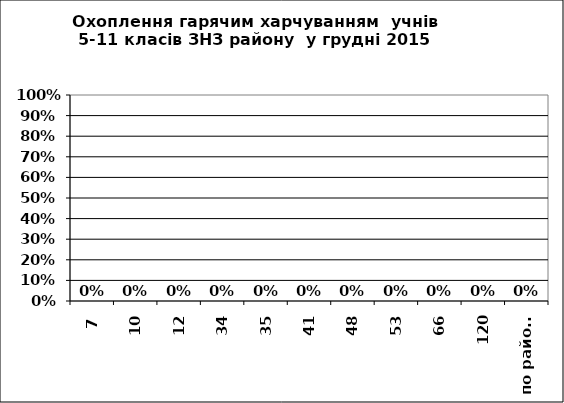
| Category | Series 0 |
|---|---|
| 7 | 0 |
| 10 | 0 |
| 12 | 0 |
| 34 | 0 |
| 35 | 0 |
| 41 | 0 |
| 48 | 0 |
| 53 | 0 |
| 66 | 0 |
| 120 | 0 |
| по району | 0 |